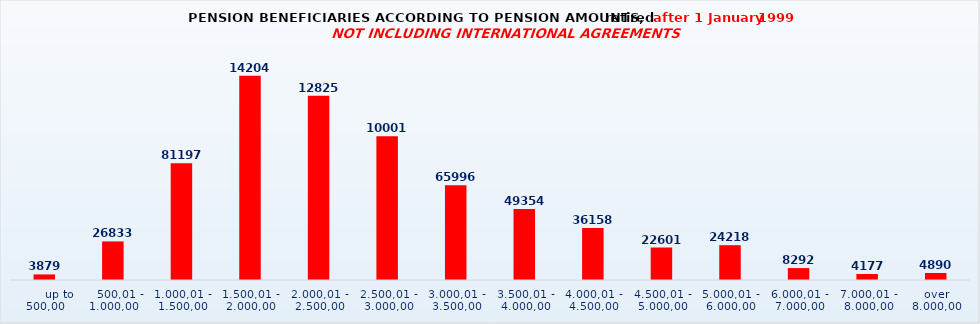
| Category | Series 0 |
|---|---|
|       up to 500,00 | 3879 |
|    500,01 - 1.000,00 | 26833 |
| 1.000,01 - 1.500,00 | 81197 |
| 1.500,01 - 2.000,00 | 142040 |
| 2.000,01 - 2.500,00 | 128257 |
| 2.500,01 - 3.000,00 | 100015 |
| 3.000,01 - 3.500,00 | 65996 |
| 3.500,01 - 4.000,00 | 49354 |
| 4.000,01 - 4.500,00 | 36158 |
| 4.500,01 - 5.000,00 | 22601 |
| 5.000,01 - 6.000,00 | 24218 |
| 6.000,01 - 7.000,00 | 8292 |
| 7.000,01 - 8.000,00 | 4177 |
| over 8.000,00 | 4890 |